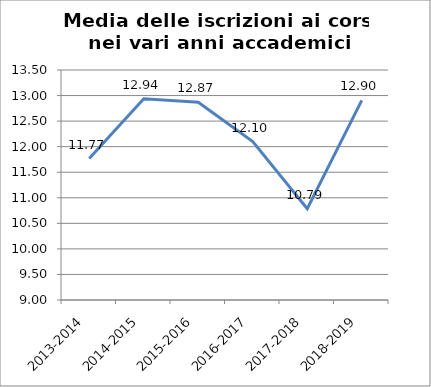
| Category | Media delle iscrizioni ai Corsi |
|---|---|
| 2013-2014 | 11.767 |
| 2014-2015 | 12.935 |
| 2015-2016 | 12.87 |
| 2016-2017 | 12.098 |
| 2017-2018 | 10.787 |
| 2018-2019 | 12.905 |